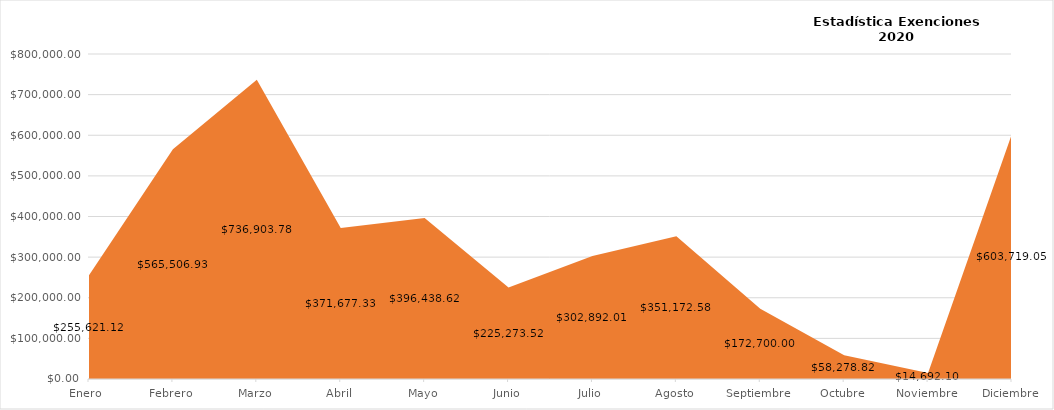
| Category | Total de Monto Condonado |
|---|---|
| Enero  | 255621.12 |
| Febrero | 565506.93 |
| Marzo | 736903.78 |
| Abril | 371677.33 |
| Mayo | 396438.62 |
| Junio | 225273.52 |
| Julio | 302892.01 |
| Agosto | 351172.58 |
| Septiembre | 172700 |
| Octubre | 58278.82 |
| Noviembre | 14692.1 |
| Diciembre | 603719.05 |